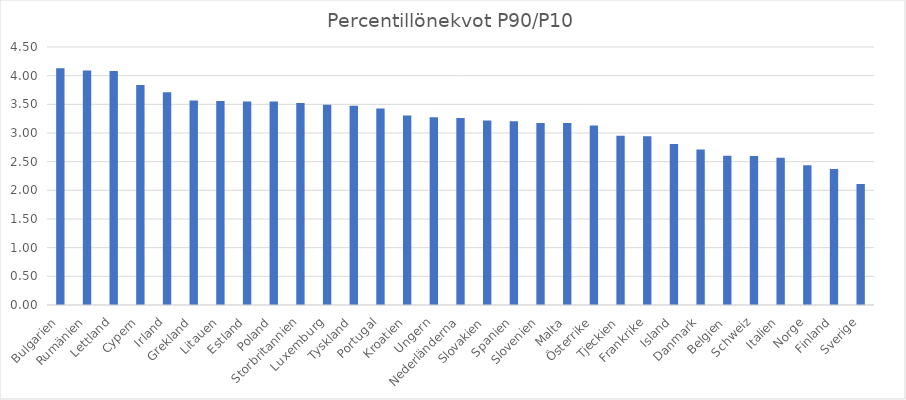
| Category | Percentillönekvot P90/P10 |
|---|---|
| Bulgarien | 4.131 |
| Rumänien | 4.092 |
| Lettland | 4.082 |
| Cypern | 3.837 |
| Irland | 3.71 |
| Grekland | 3.567 |
| Litauen | 3.556 |
| Estland | 3.55 |
| Poland | 3.549 |
| Storbritannien | 3.523 |
| Luxemburg | 3.495 |
| Tyskland | 3.477 |
| Portugal | 3.426 |
| Kroatien | 3.305 |
| Ungern | 3.275 |
| Nederländerna | 3.262 |
| Slovakien | 3.217 |
| Spanien | 3.205 |
| Slovenien | 3.176 |
| Malta | 3.176 |
| Österrike | 3.131 |
| Tjeckien | 2.951 |
| Frankrike | 2.944 |
| Island | 2.81 |
| Danmark | 2.714 |
| Belgien | 2.603 |
| Schweiz | 2.599 |
| Italien | 2.57 |
| Norge | 2.437 |
| Finland | 2.372 |
| Sverige | 2.113 |